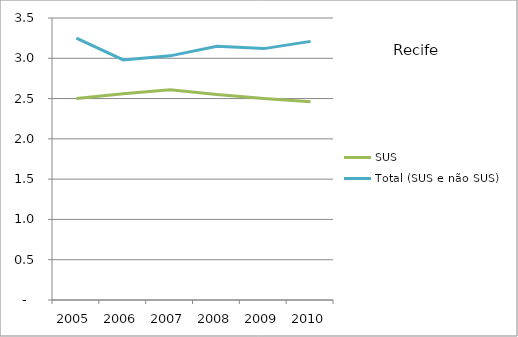
| Category | SUS | Total (SUS e não SUS) |
|---|---|---|
| 2005.0 | 2.5 | 3.25 |
| 2006.0 | 2.56 | 2.98 |
| 2007.0 | 2.61 | 3.03 |
| 2008.0 | 2.55 | 3.15 |
| 2009.0 | 2.5 | 3.12 |
| 2010.0 | 2.46 | 3.21 |